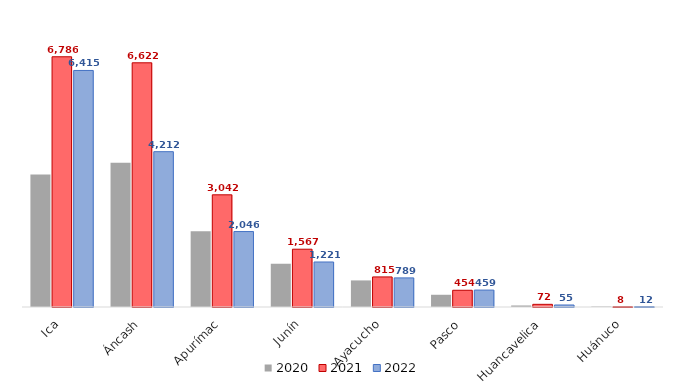
| Category | 2020 | 2021 | 2022 |
|---|---|---|---|
| Ica | 3593.84 | 6785.64 | 6414.76 |
| Áncash | 3908.83 | 6622.11 | 4212.17 |
| Apurímac | 2052.1 | 3042.13 | 2046.15 |
| Junín | 1173.83 | 1567.15 | 1220.64 |
| Ayacucho | 721.04 | 815.33 | 789.26 |
| Pasco | 331.75 | 453.53 | 458.51 |
| Huancavelica | 41.08 | 72.08 | 54.59 |
| Huánuco | 11.65 | 7.83 | 11.57 |